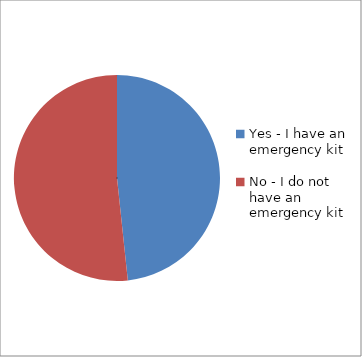
| Category | Series 0 |
|---|---|
| Yes - I have an emergency kit | 0.483 |
| No - I do not have an emergency kit | 0.517 |